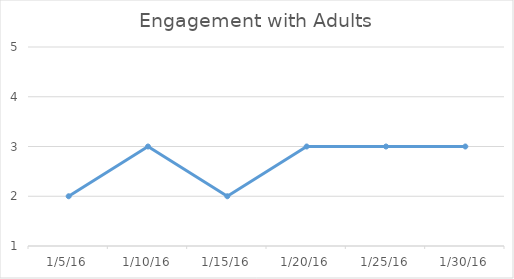
| Category | Series 0 |
|---|---|
| 1/5/16 | 2 |
| 1/10/16 | 3 |
| 1/15/16 | 2 |
| 1/20/16 | 3 |
| 1/25/16 | 3 |
| 1/30/16 | 3 |